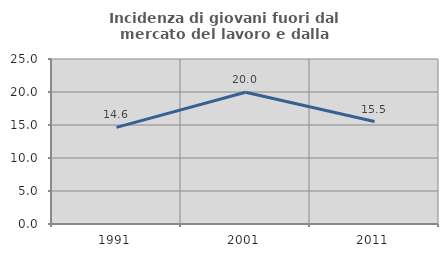
| Category | Incidenza di giovani fuori dal mercato del lavoro e dalla formazione  |
|---|---|
| 1991.0 | 14.644 |
| 2001.0 | 19.956 |
| 2011.0 | 15.528 |